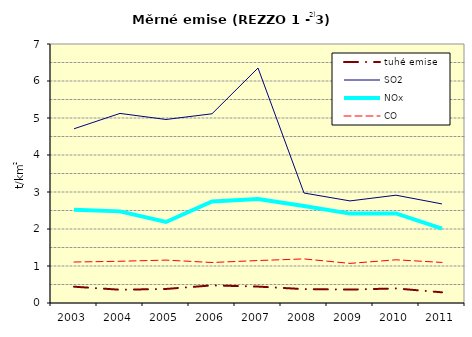
| Category | tuhé emise | SO2 | NOx | CO |
|---|---|---|---|---|
| 2003.0 | 0.441 | 4.709 | 2.521 | 1.108 |
| 2004.0 | 0.358 | 5.124 | 2.477 | 1.128 |
| 2005.0 | 0.379 | 4.96 | 2.19 | 1.16 |
| 2006.0 | 0.476 | 5.114 | 2.746 | 1.095 |
| 2007.0 | 0.444 | 6.352 | 2.808 | 1.147 |
| 2008.0 | 0.375 | 2.973 | 2.622 | 1.192 |
| 2009.0 | 0.363 | 2.759 | 2.416 | 1.071 |
| 2010.0 | 0.394 | 2.914 | 2.421 | 1.168 |
| 2011.0 | 0.289 | 2.678 | 2.013 | 1.097 |